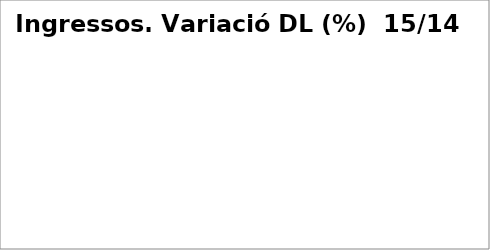
| Category | Series 0 |
|---|---|
| Impostos directes | 0.074 |
| Impostos indirectes | 0.201 |
| Taxes, preus públics i altres ingressos | -0.046 |
| Transferències corrents | 0.061 |
| Ingressos patrimonials | -0.053 |
| Venda d'inversions reals | 0 |
| Transferències de capital | -0.239 |
| Actius financers* | 0 |
| Passius financers | 0.192 |